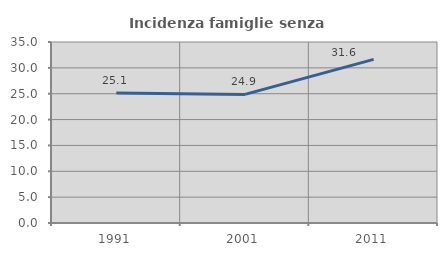
| Category | Incidenza famiglie senza nuclei |
|---|---|
| 1991.0 | 25.146 |
| 2001.0 | 24.864 |
| 2011.0 | 31.642 |